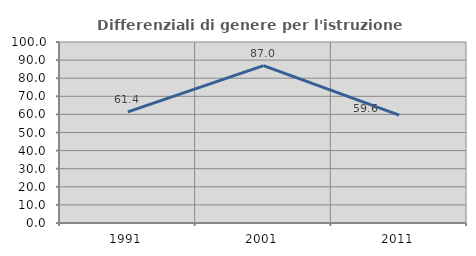
| Category | Differenziali di genere per l'istruzione superiore |
|---|---|
| 1991.0 | 61.435 |
| 2001.0 | 86.968 |
| 2011.0 | 59.623 |